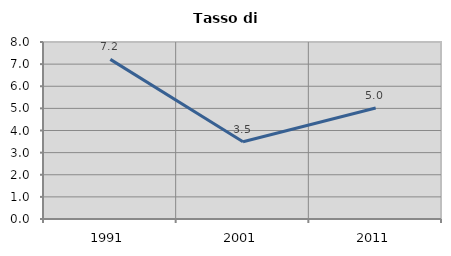
| Category | Tasso di disoccupazione   |
|---|---|
| 1991.0 | 7.215 |
| 2001.0 | 3.493 |
| 2011.0 | 5.02 |